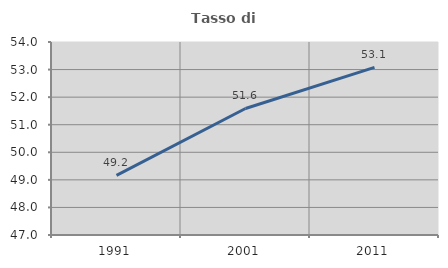
| Category | Tasso di occupazione   |
|---|---|
| 1991.0 | 49.16 |
| 2001.0 | 51.589 |
| 2011.0 | 53.08 |